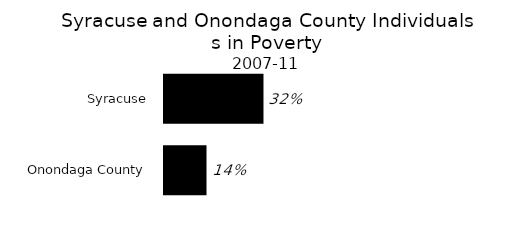
| Category | Series 0 |
|---|---|
| Onondaga County | 0.138 |
| Syracuse | 0.323 |